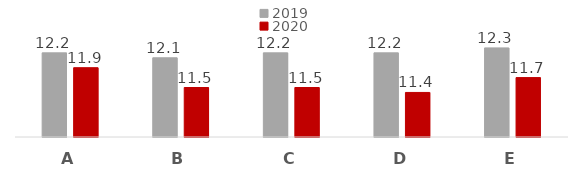
| Category | 2019 | 2020 |
|---|---|---|
| A | 12.2 | 11.9 |
| B | 12.1 | 11.5 |
| C | 12.2 | 11.5 |
| D | 12.2 | 11.4 |
| E | 12.3 | 11.7 |